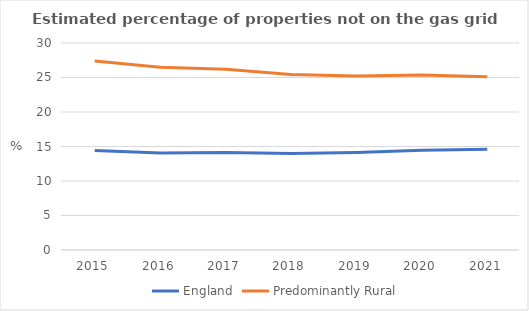
| Category | England | Predominantly Rural |
|---|---|---|
| 2015.0 | 14.407 | 27.399 |
| 2016.0 | 14.046 | 26.503 |
| 2017.0 | 14.123 | 26.2 |
| 2018.0 | 13.981 | 25.437 |
| 2019.0 | 14.133 | 25.228 |
| 2020.0 | 14.47 | 25.373 |
| 2021.0 | 14.601 | 25.126 |